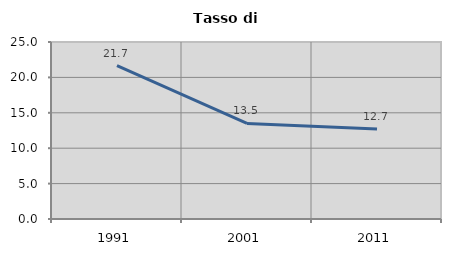
| Category | Tasso di disoccupazione   |
|---|---|
| 1991.0 | 21.66 |
| 2001.0 | 13.501 |
| 2011.0 | 12.726 |